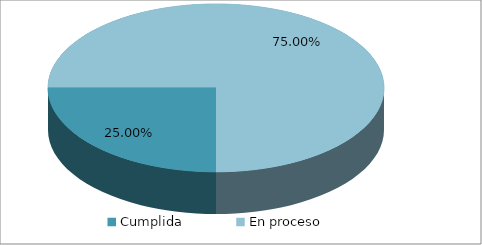
| Category | Series 0 |
|---|---|
| Cumplida | 0.25 |
| En proceso | 0.75 |